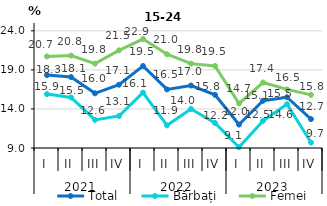
| Category | Total | Bărbați | Femei |
|---|---|---|---|
| 0 | 18.335 | 15.899 | 20.718 |
| 1 | 18.083 | 15.467 | 20.834 |
| 2 | 16 | 12.6 | 19.8 |
| 3 | 17.1 | 13.1 | 21.5 |
| 4 | 19.497 | 16.088 | 22.949 |
| 5 | 16.5 | 11.9 | 21 |
| 6 | 17 | 14 | 19.8 |
| 7 | 15.8 | 12.2 | 19.5 |
| 8 | 12 | 9.1 | 14.7 |
| 9 | 15.051 | 12.471 | 17.384 |
| 10 | 15.5 | 14.6 | 16.5 |
| 11 | 12.7 | 9.7 | 15.8 |